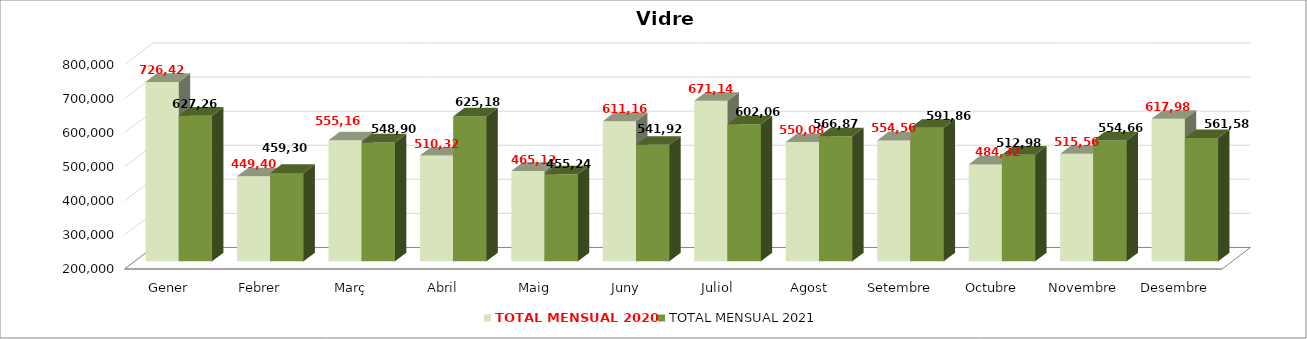
| Category | TOTAL MENSUAL 2020 | TOTAL MENSUAL 2021 |
|---|---|---|
| Gener | 726420 | 627259.98 |
| Febrer | 449399.99 | 459300 |
| Març | 555160 | 548899.98 |
| Abril | 510319.99 | 625180.02 |
| Maig | 465120.02 | 455239.99 |
| Juny | 611160.01 | 541920.01 |
| Juliol | 671139.98 | 602060.01 |
| Agost | 550080 | 566870.01 |
| Setembre | 554559.99 | 591860 |
| Octubre | 484320.02 | 512980 |
| Novembre | 515559.99 | 554660.13 |
| Desembre | 617980.03 | 561589 |